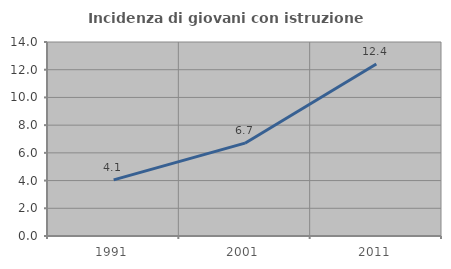
| Category | Incidenza di giovani con istruzione universitaria |
|---|---|
| 1991.0 | 4.052 |
| 2001.0 | 6.699 |
| 2011.0 | 12.409 |